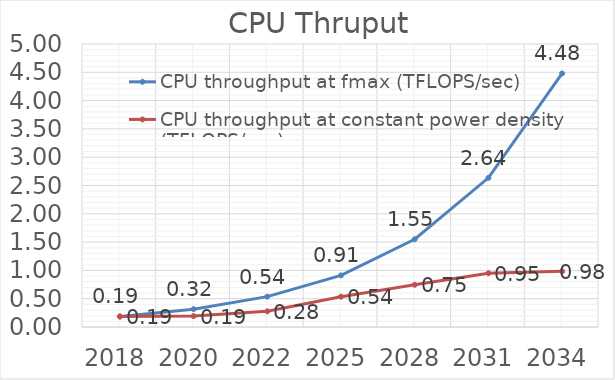
| Category | CPU throughput at fmax (TFLOPS/sec) | CPU throughput at constant power density (TFLOPS/sec) |
|---|---|---|
| 2018.0 | 0.186 | 0.186 |
| 2020.0 | 0.316 | 0.193 |
| 2022.0 | 0.536 | 0.277 |
| 2025.0 | 0.912 | 0.535 |
| 2028.0 | 1.55 | 0.746 |
| 2031.0 | 2.635 | 0.949 |
| 2034.0 | 4.48 | 0.984 |